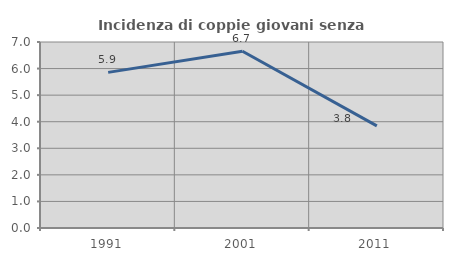
| Category | Incidenza di coppie giovani senza figli |
|---|---|
| 1991.0 | 5.857 |
| 2001.0 | 6.651 |
| 2011.0 | 3.843 |